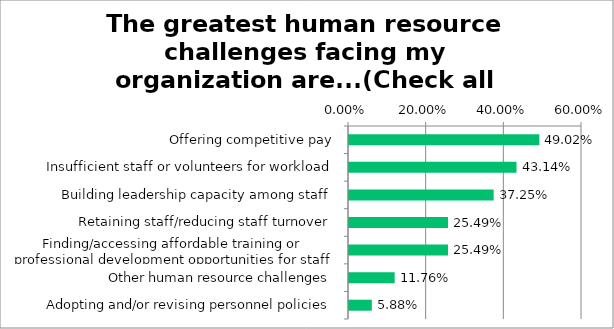
| Category | Responses |
|---|---|
| Offering competitive pay | 0.49 |
| Insufficient staff or volunteers for workload | 0.431 |
| Building leadership capacity among staff | 0.372 |
| Retaining staff/reducing staff turnover | 0.255 |
| Finding/accessing affordable training or professional development opportunities for staff | 0.255 |
| Other human resource challenges | 0.118 |
| Adopting and/or revising personnel policies | 0.059 |